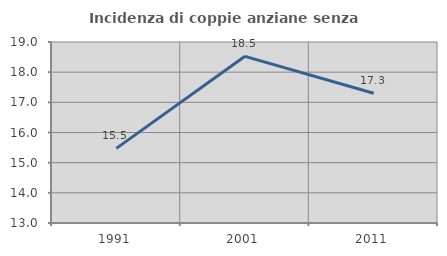
| Category | Incidenza di coppie anziane senza figli  |
|---|---|
| 1991.0 | 15.474 |
| 2001.0 | 18.525 |
| 2011.0 | 17.301 |